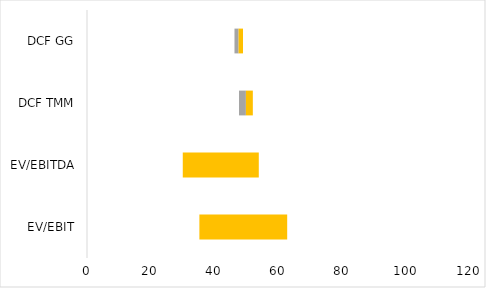
| Category | Min  | Q1 | Med | Q3 | Max |
|---|---|---|---|---|---|
| EV/EBIT | 8.006 | 4.351 | 22.857 | 27.509 | 46.985 |
| EV/EBITDA | 12.814 | 2.719 | 14.474 | 23.818 | 29.165 |
| DCF TMM | 45.446 | 2.171 | 2.171 | 2.171 | 2.171 |
| DCF GG | 45.004 | 1.206 | 1.287 | 1.377 | 1.477 |